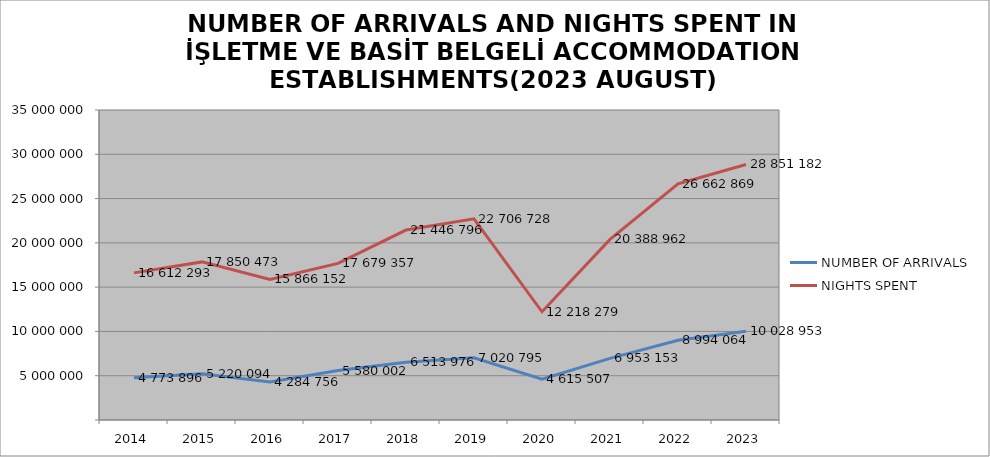
| Category | NUMBER OF ARRIVALS | NIGHTS SPENT |
|---|---|---|
| 2014 | 4773896 | 16612293 |
| 2015 | 5220094 | 17850473 |
| 2016 | 4284756 | 15866152 |
| 2017 | 5580002 | 17679357 |
| 2018 | 6513976 | 21446796 |
| 2019 | 7020795 | 22706728 |
| 2020 | 4615507 | 12218279 |
| 2021 | 6953153 | 20388962 |
| 2022 | 8994064 | 26662869 |
| 2023 | 10028953 | 28851182 |